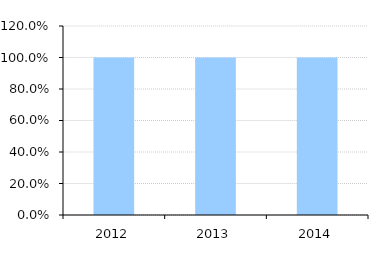
| Category | Gross Profit Margin |
|---|---|
| 2012.0 | 1 |
| 2013.0 | 1 |
| 2014.0 | 1 |